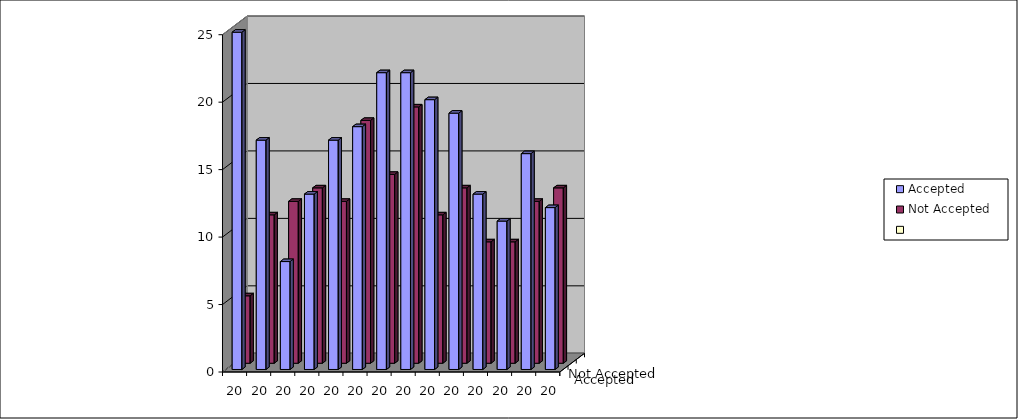
| Category | Accepted | Not Accepted | Series 2 |
|---|---|---|---|
| 2010 | 25 | 5 |  |
| 2011 | 17 | 11 |  |
| 2012 | 8 | 12 |  |
| 2013 | 13 | 13 |  |
| 2014 | 17 | 12 |  |
| 2015 | 18 | 18 |  |
| 2016 | 22 | 14 |  |
| 2017 | 22 | 19 |  |
| 2018 | 20 | 11 |  |
| 2019 | 19 | 13 |  |
| 2020 | 13 | 9 |  |
| 2021 | 11 | 9 |  |
| 2022 | 16 | 12 |  |
| 2023 | 12 | 13 |  |